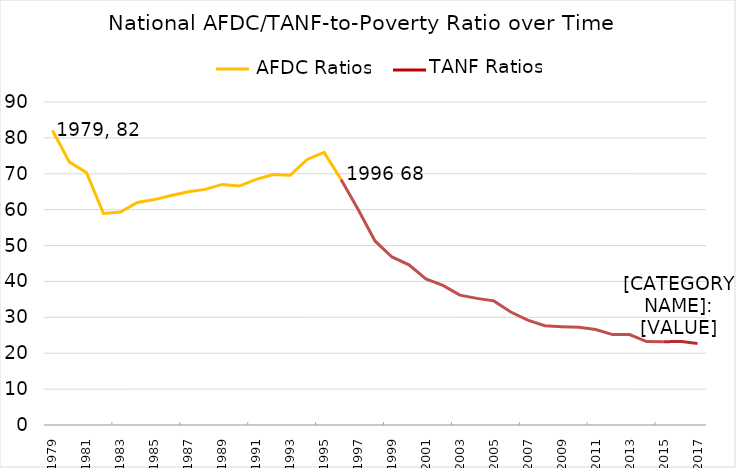
| Category | TPR |
|---|---|
| 1979-01-01 | 82.061 |
| 1980-01-01 | 73.245 |
| 1981-01-01 | 70.38 |
| 1982-01-01 | 58.928 |
| 1983-01-01 | 59.329 |
| 1984-01-01 | 62.017 |
| 1985-01-01 | 62.807 |
| 1986-01-01 | 63.968 |
| 1987-01-01 | 65.007 |
| 1988-01-01 | 65.658 |
| 1989-01-01 | 67.032 |
| 1990-01-01 | 66.57 |
| 1991-01-01 | 68.428 |
| 1992-01-01 | 69.77 |
| 1993-01-01 | 69.573 |
| 1994-01-01 | 73.982 |
| 1995-01-01 | 75.967 |
| 1996-01-01 | 68.434 |
| 1997-01-01 | 60.107 |
| 1998-01-01 | 51.281 |
| 1999-01-01 | 46.815 |
| 2000-01-01 | 44.625 |
| 2001-01-01 | 40.721 |
| 2002-01-01 | 38.883 |
| 2003-01-01 | 36.191 |
| 2004-01-01 | 35.279 |
| 2005-01-01 | 34.584 |
| 2006-01-01 | 31.487 |
| 2007-01-01 | 29.231 |
| 2008-01-01 | 27.663 |
| 2009-01-01 | 27.409 |
| 2010-01-01 | 27.258 |
| 2011-01-01 | 26.626 |
| 2012-01-01 | 25.192 |
| 2013-01-01 | 25.183 |
| 2014-01-01 | 23.248 |
| 2015-01-01 | 23.188 |
| 2016-01-01 | 23.299 |
| 2017-01-01 | 22.708 |